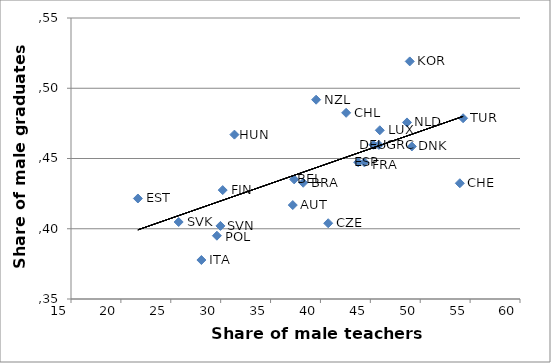
| Category | Series 0 |
|---|---|
| 37.227224967361 | 41.686 |
| 37.366470459996 | 43.513 |
| 42.575884748681 | 48.251 |
| 40.778953363563 | 40.392 |
| 49.160943565243 | 45.86 |
| 21.704586493319 | 42.154 |
| 30.203421797117 | 42.752 |
| 44.409011047197 | 44.721 |
| 45.310478447411 | 45.975 |
| 45.857599868756 | 45.967 |
| 31.378026070763 | 46.7 |
| 28.068476666792 | 37.776 |
| 48.950614286408 | 51.91 |
| 45.94982078853 | 47.009 |
| 48.673633985333 | 47.567 |
| 39.56567237386 | 49.185 |
| 29.622827450278 | 39.505 |
| 25.79105532968 | 40.48 |
| 29.977628635347 | 40.202 |
| 43.781587661206 | 44.733 |
| 53.96790980052 | 43.238 |
| 54.296865014103 | 47.865 |
| 38.272507337048 | 43.274 |